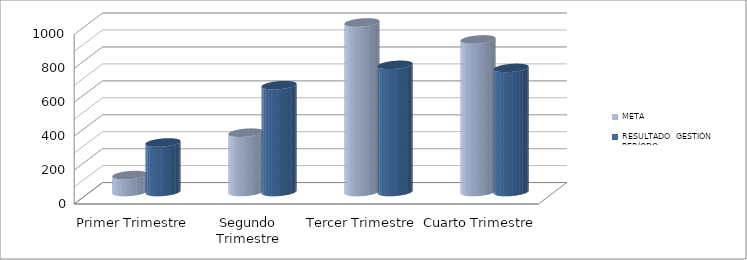
| Category | META | RESULTADO  GESTIÓN PERÍODO |
|---|---|---|
| Primer Trimestre | 100 | 292 |
| Segundo Trimestre | 350 | 630 |
| Tercer Trimestre | 1000 | 750 |
| Cuarto Trimestre | 900 | 732 |